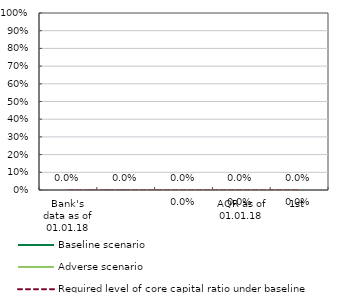
| Category | Baseline scenario | Adverse scenario | Required level of core capital ratio under baseline scenario | Required level of core capital ratio under adverse scenario |
|---|---|---|---|---|
| Bank's data as of 01.01.18 | 0 | 0 | 0 | 0 |
| AQR as of 01.01.18 | 0 | 0 | 0 | 0 |
| 1st | 0 | 0 | 0 | 0 |
| 2nd | 0 | 0 | 0 | 0 |
| 3rd | 0 | 0 | 0 | 0 |